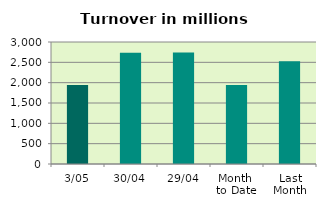
| Category | Series 0 |
|---|---|
| 3/05 | 1945.674 |
| 30/04 | 2738.389 |
| 29/04 | 2739.547 |
| Month 
to Date | 1945.674 |
| Last
Month | 2525.558 |